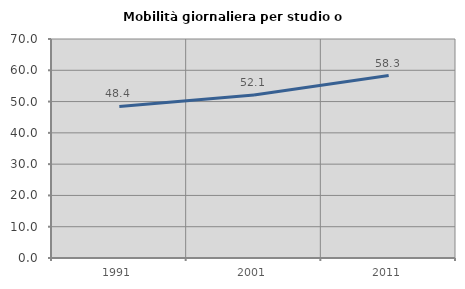
| Category | Mobilità giornaliera per studio o lavoro |
|---|---|
| 1991.0 | 48.449 |
| 2001.0 | 52.078 |
| 2011.0 | 58.333 |